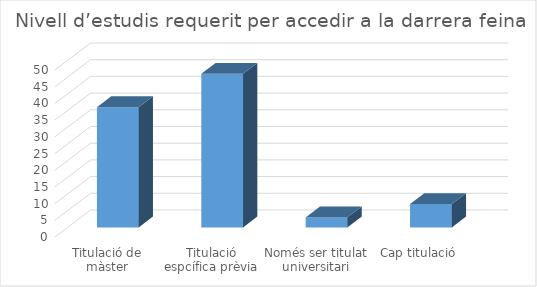
| Category | Series 0 |
|---|---|
| Titulació de màster | 36 |
| Titulació espcífica prèvia | 46 |
| Només ser titulat universitari | 3 |
| Cap titulació | 7 |